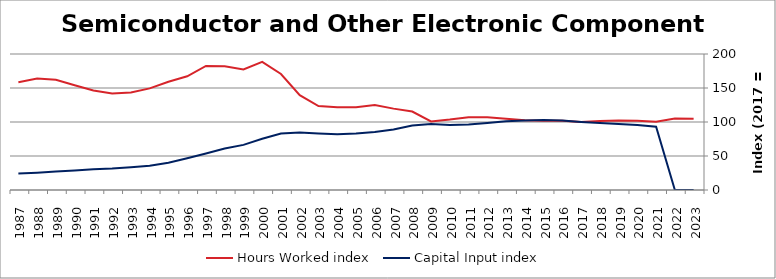
| Category | Hours Worked index | Capital Input index |
|---|---|---|
| 2023.0 | 104.756 | 0 |
| 2022.0 | 105.078 | 0 |
| 2021.0 | 100.274 | 93.081 |
| 2020.0 | 101.727 | 95.563 |
| 2019.0 | 102.286 | 97.205 |
| 2018.0 | 101.612 | 98.36 |
| 2017.0 | 100 | 100 |
| 2016.0 | 101.922 | 102.126 |
| 2015.0 | 101.741 | 102.797 |
| 2014.0 | 102.717 | 102.284 |
| 2013.0 | 104.836 | 101.148 |
| 2012.0 | 107.155 | 98.478 |
| 2011.0 | 107.139 | 96.421 |
| 2010.0 | 103.537 | 95.439 |
| 2009.0 | 100.737 | 97.222 |
| 2008.0 | 115.4 | 94.987 |
| 2007.0 | 119.649 | 88.847 |
| 2006.0 | 124.899 | 85.324 |
| 2005.0 | 121.854 | 83.208 |
| 2004.0 | 121.846 | 81.919 |
| 2003.0 | 123.539 | 83.166 |
| 2002.0 | 139.408 | 84.657 |
| 2001.0 | 170.573 | 83.013 |
| 2000.0 | 188.52 | 75.435 |
| 1999.0 | 177.277 | 66.382 |
| 1998.0 | 181.913 | 60.886 |
| 1997.0 | 182.455 | 53.638 |
| 1996.0 | 167.265 | 46.706 |
| 1995.0 | 159.213 | 40.18 |
| 1994.0 | 149.468 | 35.561 |
| 1993.0 | 143.38 | 33.301 |
| 1992.0 | 141.79 | 31.485 |
| 1991.0 | 146.396 | 30.346 |
| 1990.0 | 153.971 | 28.726 |
| 1989.0 | 162.051 | 27.056 |
| 1988.0 | 164.032 | 25.538 |
| 1987.0 | 158.493 | 24.362 |